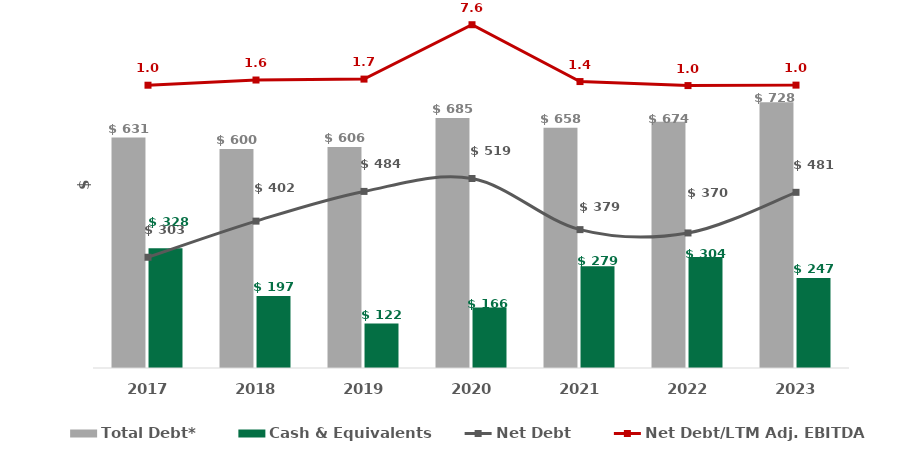
| Category | Total Debt* | Cash & Equivalents |
|---|---|---|
| 2017.0 | 631.4 | 328.1 |
| 2018.0 | 599.7 | 197.3 |
| 2019.0 | 605.7 | 121.9 |
| 2020.0 | 685.2 | 166 |
| 2021.0 | 657.9 | 278.8 |
| 2022.0 | 674.4 | 304.4 |
| 2023.0 | 728.1 | 246.8 |